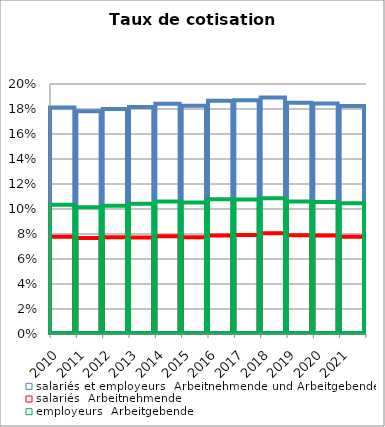
| Category | salariés et employeurs | salariés | employeurs |
|---|---|---|---|
| 2010 | 0.181 | 0.078 | 0.103 |
| 2011 | 0.178 | 0.077 | 0.101 |
| 2012 | 0.18 | 0.077 | 0.103 |
| 2013 | 0.182 | 0.077 | 0.104 |
| 2014 | 0.184 | 0.078 | 0.106 |
| 2015 | 0.183 | 0.078 | 0.105 |
| 2016 | 0.187 | 0.079 | 0.108 |
| 2017 | 0.187 | 0.079 | 0.108 |
| 2018 | 0.189 | 0.081 | 0.109 |
| 2019 | 0.185 | 0.079 | 0.106 |
| 2020 | 0.184 | 0.079 | 0.106 |
| 2021 | 0.182 | 0.078 | 0.105 |